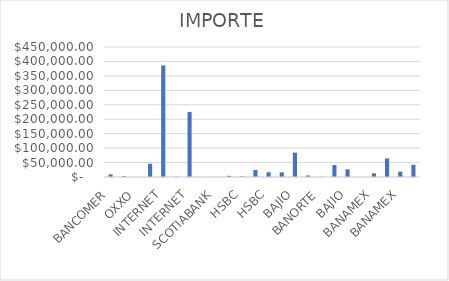
| Category | IMPORTE |
|---|---|
| BANCOMER | 9152.58 |
| BANORTE | 3148.85 |
| OXXO | 113 |
| BANORTE | 45997.63 |
| INTERNET | 386029.64 |
| OXXO | 1370 |
| INTERNET | 225374.12 |
| SANTANDER | 143.41 |
| SCOTIABANK | 573.15 |
| BANCOMER | 4054 |
| HSBC | 2135.32 |
| BANCOMER | 24167.71 |
| HSBC | 16515.42 |
| SANTANDER | 16102.05 |
| BAJIO | 84223.3 |
| HSBC | 5220.37 |
| BANORTE | 754 |
| INTERNET | 41612.13 |
| BAJIO | 26441.6 |
| AZTECA | 269.51 |
| BANAMEX | 12716.53 |
| ESTAC.BANORTE | 64335 |
| BANAMEX | 18519.15 |
| OXXO | 42242.79 |